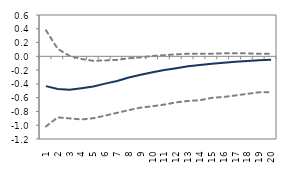
| Category | lower bound | median | upper bound |
|---|---|---|---|
| 1.0 | -1.018 | -0.433 | 0.379 |
| 2.0 | -0.886 | -0.474 | 0.108 |
| 3.0 | -0.901 | -0.486 | 0.006 |
| 4.0 | -0.916 | -0.464 | -0.039 |
| 5.0 | -0.899 | -0.438 | -0.065 |
| 6.0 | -0.861 | -0.396 | -0.06 |
| 7.0 | -0.82 | -0.357 | -0.051 |
| 8.0 | -0.781 | -0.308 | -0.028 |
| 9.0 | -0.744 | -0.268 | -0.015 |
| 10.0 | -0.724 | -0.23 | 0.006 |
| 11.0 | -0.7 | -0.199 | 0.018 |
| 12.0 | -0.668 | -0.172 | 0.029 |
| 13.0 | -0.648 | -0.145 | 0.038 |
| 14.0 | -0.637 | -0.126 | 0.037 |
| 15.0 | -0.602 | -0.108 | 0.038 |
| 16.0 | -0.59 | -0.092 | 0.044 |
| 17.0 | -0.568 | -0.078 | 0.045 |
| 18.0 | -0.544 | -0.066 | 0.043 |
| 19.0 | -0.521 | -0.056 | 0.037 |
| 20.0 | -0.52 | -0.048 | 0.035 |